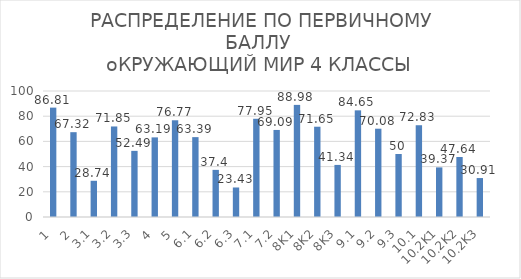
| Category | Камышловский муниципальный район |
|---|---|
| 1 | 86.81 |
| 2 | 67.32 |
| 3,1 | 28.74 |
| 3,2 | 71.85 |
| 3,3 | 52.49 |
| 4 | 63.19 |
| 5 | 76.77 |
| 6,1 | 63.39 |
| 6,2 | 37.4 |
| 6,3 | 23.43 |
| 7,1 | 77.95 |
| 7,2 | 69.09 |
| 8K1 | 88.98 |
| 8K2 | 71.65 |
| 8K3 | 41.34 |
| 9,1 | 84.65 |
| 9,2 | 70.08 |
| 9,3 | 50 |
| 10,1 | 72.83 |
| 10.2K1 | 39.37 |
| 10.2K2 | 47.64 |
| 10.2K3 | 30.91 |